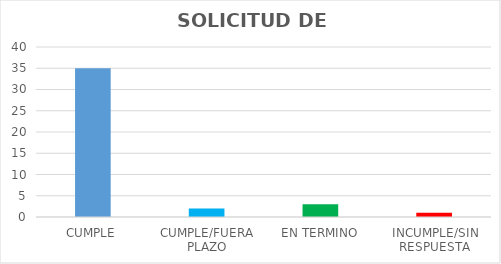
| Category | TOTAL |
|---|---|
| CUMPLE | 35 |
| CUMPLE/FUERA PLAZO | 2 |
| EN TERMINO | 3 |
| INCUMPLE/SIN RESPUESTA | 1 |